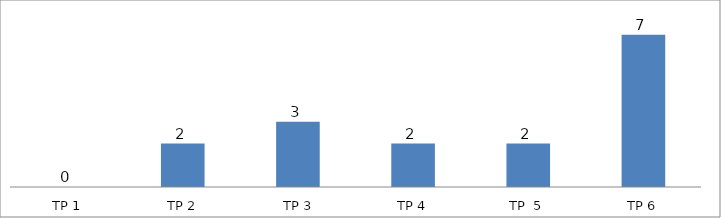
| Category | BIL. MURID |
|---|---|
| TP 1 | 0 |
| TP 2 | 2 |
|  TP 3 | 3 |
| TP 4 | 2 |
| TP  5 | 2 |
| TP 6 | 7 |